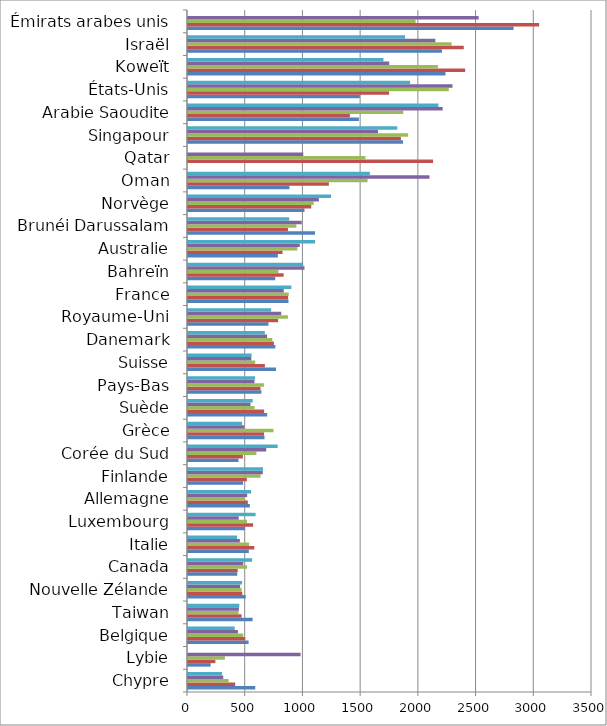
| Category | Series 0 | Series 1 | Series 2 | Series 3 | Series 4 |
|---|---|---|---|---|---|
| Chypre | 582.641 | 409.049 | 352.109 | 305.364 | 294.12 |
| Lybie | 196.224 | 237.104 | 319.775 | 975.65 | 0 |
| Belgique | 525.174 | 495.066 | 478.604 | 432.13 | 404.486 |
| Taiwan | 559.894 | 464.126 | 437.393 | 441.336 | 444.588 |
| Nouvelle Zélande | 499.863 | 470.219 | 464.257 | 451.604 | 468.74 |
| Canada | 426.511 | 430.504 | 511.648 | 479.033 | 555.367 |
| Italie | 527.037 | 574.091 | 529.863 | 449.309 | 425.021 |
| Luxembourg | 494.636 | 563.632 | 511.184 | 439.395 | 585.478 |
| Allemagne | 535.823 | 518.267 | 493.979 | 512.485 | 546.423 |
| Finlande | 477.276 | 509.69 | 628.729 | 647.748 | 649.495 |
| Corée du Sud | 437.24 | 475.324 | 592.225 | 677.437 | 776.712 |
| Grèce | 662.874 | 658.235 | 740.265 | 487.059 | 468.644 |
| Suède | 686.437 | 659.517 | 577.001 | 541.378 | 560.456 |
| Pays-Bas | 636.023 | 628.134 | 657.774 | 575.748 | 581.322 |
| Suisse | 762.172 | 665.926 | 582.088 | 548.208 | 551.057 |
| Danemark | 756.916 | 743.968 | 730.093 | 685.027 | 665.59 |
| Royaume-Uni | 697.049 | 780.646 | 865.729 | 807.468 | 720.319 |
| France | 870.446 | 867.215 | 872.86 | 829.816 | 895.533 |
| Bahreïn | 755.854 | 828.689 | 783.683 | 1009.419 | 998.575 |
| Australie | 778.542 | 819.013 | 946.909 | 968.261 | 1100.913 |
| Brunéi Darussalam | 1100.171 | 865.697 | 938.266 | 985.21 | 876.23 |
| Norvège | 1009.29 | 1067.594 | 1088.213 | 1133.913 | 1239.149 |
| Oman | 878.457 | 1220.515 | 1555.66 | 2091.837 | 1575.53 |
| Qatar | 0 | 2122.754 | 1536.742 | 998.71 | 0 |
| Singapour | 1863.317 | 1844.512 | 1907.1 | 1646.45 | 1812.513 |
| Arabie Saoudite | 1480.671 | 1402.127 | 1864.885 | 2206.203 | 2169.663 |
| États-Unis | 1488.376 | 1742.265 | 2259.529 | 2291.382 | 1924.215 |
| Koweït | 2230.649 | 2401.216 | 2165.079 | 1743.023 | 1692.945 |
| Israël | 2200.066 | 2389.143 | 2284.035 | 2142.686 | 1880.081 |
| Émirats arabes unis | 2820.263 | 3041.864 | 1972.148 | 2518.022 | 0 |